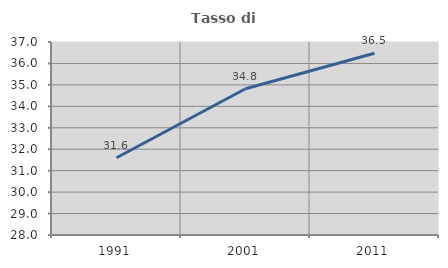
| Category | Tasso di occupazione   |
|---|---|
| 1991.0 | 31.601 |
| 2001.0 | 34.818 |
| 2011.0 | 36.476 |